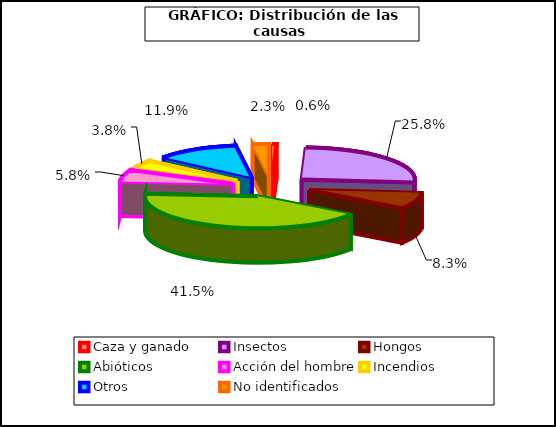
| Category | Series 0 |
|---|---|
| Caza y ganado | 19 |
| Insectos | 833 |
| Hongos  | 267 |
| Abióticos | 1337 |
| Acción del hombre | 188 |
| Incendios | 123 |
| Otros | 384 |
| No identificados | 73 |